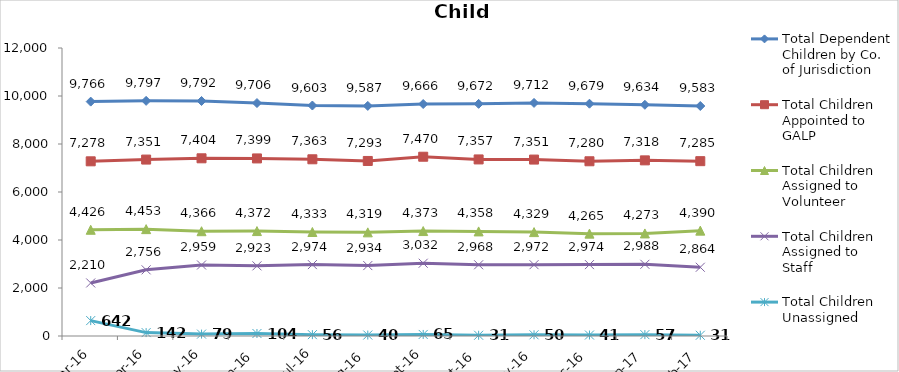
| Category | Total Dependent Children by Co. of Jurisdiction | Total Children Appointed to GALP | Total Children Assigned to Volunteer | Total Children Assigned to Staff | Total Children Unassigned |
|---|---|---|---|---|---|
| Mar-16 | 9766 | 7278 | 4426 | 2210 | 642 |
| Apr-16 | 9797 | 7351 | 4453 | 2756 | 142 |
| May-16 | 9792 | 7404 | 4366 | 2959 | 79 |
| Jun-16 | 9706 | 7399 | 4372 | 2923 | 104 |
| Jul-16 | 9603 | 7363 | 4333 | 2974 | 56 |
| Aug-16 | 9587 | 7293 | 4319 | 2934 | 40 |
| Sep-16 | 9666 | 7470 | 4373 | 3032 | 65 |
| Oct-16 | 9672 | 7357 | 4358 | 2968 | 31 |
| Nov-16 | 9712 | 7351 | 4329 | 2972 | 50 |
| Dec-16 | 9679 | 7280 | 4265 | 2974 | 41 |
| Jan-17 | 9634 | 7318 | 4273 | 2988 | 57 |
| Feb-17 | 9583 | 7285 | 4390 | 2864 | 31 |